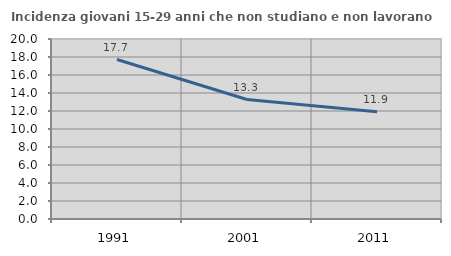
| Category | Incidenza giovani 15-29 anni che non studiano e non lavorano  |
|---|---|
| 1991.0 | 17.716 |
| 2001.0 | 13.274 |
| 2011.0 | 11.927 |